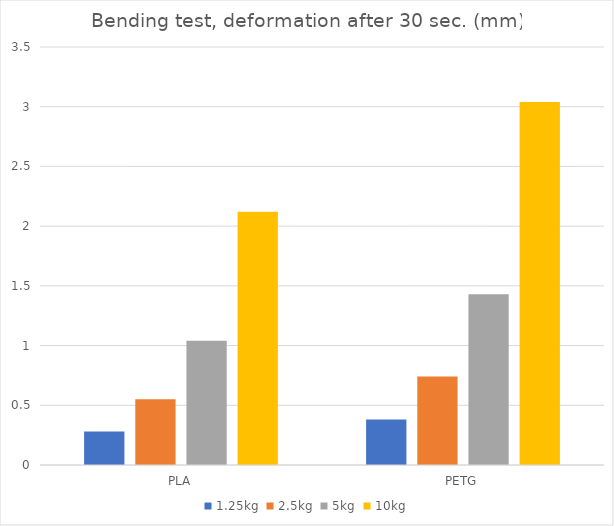
| Category | 1.25kg | 2.5kg | 5kg | 10kg |
|---|---|---|---|---|
| PLA | 0.28 | 0.55 | 1.04 | 2.12 |
| PETG | 0.38 | 0.74 | 1.43 | 3.04 |